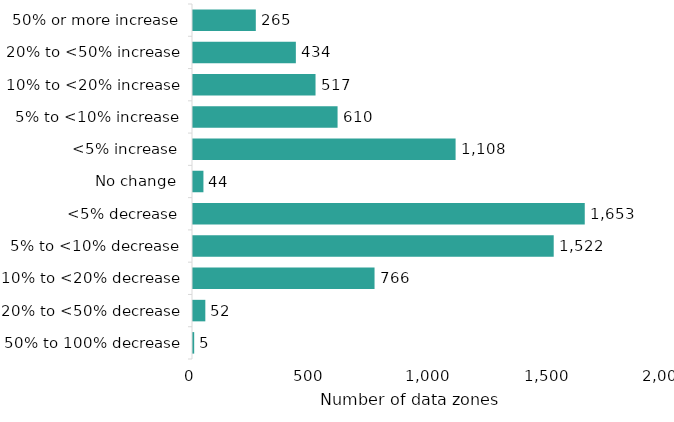
| Category | 50% or more increase |
|---|---|
| 50% or more increase | 265 |
| 20% to <50% increase | 434 |
| 10% to <20% increase | 517 |
| 5% to <10% increase | 610 |
| <5% increase | 1108 |
| No change | 44 |
| <5% decrease | 1653 |
| 5% to <10% decrease | 1522 |
| 10% to <20% decrease | 766 |
| 20% to <50% decrease | 52 |
| 50% to 100% decrease | 5 |